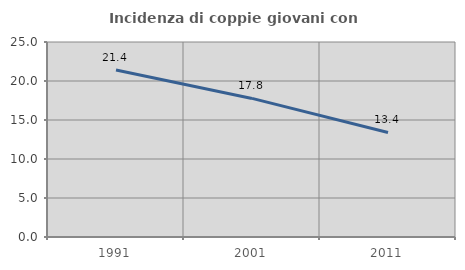
| Category | Incidenza di coppie giovani con figli |
|---|---|
| 1991.0 | 21.407 |
| 2001.0 | 17.767 |
| 2011.0 | 13.407 |